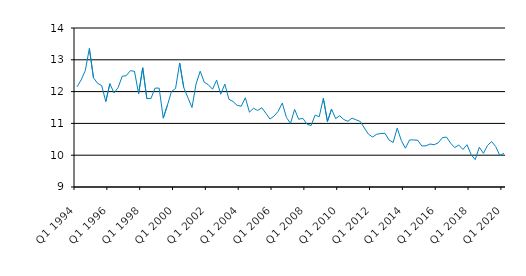
| Category | Series 0 |
|---|---|
| Q1 1994 | 12.15 |
| Q2 1994 | 12.369 |
| Q3 1994 | 12.659 |
| Q4 1994 | 13.357 |
| Q1 1995 | 12.435 |
| Q2 1995 | 12.262 |
| Q3 1995 | 12.188 |
| Q4 1995 | 11.688 |
| Q1 1996 | 12.25 |
| Q2 1996 | 11.958 |
| Q3 1996 | 12.125 |
| Q4 1996 | 12.483 |
| Q1 1997 | 12.5 |
| Q2 1997 | 12.662 |
| Q3 1997 | 12.633 |
| Q4 1997 | 11.933 |
| Q1 1998 | 12.75 |
| Q2 1998 | 11.781 |
| Q3 1998 | 11.781 |
| Q4 1998 | 12.11 |
| Q1 1999 | 12.11 |
| Q2 1999 | 11.166 |
| Q3 1999 | 11.566 |
| Q4 1999 | 12 |
| Q1 2000 | 12.1 |
| Q2 2000 | 12.899 |
| Q3 2000 | 12.125 |
| Q4 2000 | 11.812 |
| Q1 2001 | 11.5 |
| Q2 2001 | 12.241 |
| Q3 2001 | 12.642 |
| Q4 2001 | 12.291 |
| Q1 2002 | 12.215 |
| Q2 2002 | 12.075 |
| Q3 2002 | 12.36 |
| Q4 2002 | 11.917 |
| Q1 2003 | 12.236 |
| Q2 2003 | 11.761 |
| Q3 2003 | 11.688 |
| Q4 2003 | 11.569 |
| Q1 2004 | 11.539 |
| Q2 2004 | 11.807 |
| Q3 2004 | 11.354 |
| Q4 2004 | 11.477 |
| Q1 2005 | 11.406 |
| Q2 2005 | 11.493 |
| Q3 2005 | 11.318 |
| Q4 2005 | 11.136 |
| Q1 2006 | 11.231 |
| Q2 2006 | 11.38 |
| Q3 2006 | 11.64 |
| Q4 2006 | 11.19 |
| Q1 2007 | 11 |
| Q2 2007 | 11.44 |
| Q3 2007 | 11.13 |
| Q4 2007 | 11.16 |
| Q1 2008 | 10.98 |
| Q2 2008 | 10.93 |
| Q3 2008 | 11.26 |
| Q4 2008 | 11.21 |
| Q1 2009 | 11.79 |
| Q2 2009 | 11.06 |
| Q3 2009 | 11.45 |
| Q4 2009 | 11.15 |
| Q1 2010 | 11.24 |
| Q2 2010 | 11.12 |
| Q3 2010 | 11.067 |
| Q4 2010 | 11.166 |
| Q1 2011 | 11.11 |
| Q2 2011 | 11.06 |
| Q3 2011 | 10.855 |
| Q4 2011 | 10.66 |
| Q1 2012 | 10.57 |
| Q2 2012 | 10.66 |
| Q3 2012 | 10.68 |
| Q4 2012 | 10.69 |
| Q1 2013 | 10.48 |
| Q2 2013 | 10.4 |
| Q3 2013 | 10.85 |
| Q4 2013 | 10.46 |
| Q1 2014 | 10.22 |
| Q2 2014 | 10.479 |
| Q3 2014 | 10.48 |
| Q4 2014 | 10.47 |
| Q1 2015 | 10.29 |
| Q2 2015 | 10.295 |
| Q3 2015 | 10.352 |
| Q4 2015 | 10.33 |
| Q1 2016 | 10.39 |
| Q2 2016 | 10.55 |
| Q3 2016 | 10.57 |
| Q4 2016 | 10.38 |
| Q1 2017 | 10.24 |
| Q2 2017 | 10.32 |
| Q3 2017 | 10.18 |
| Q4 2017 | 10.33 |
| Q1 2018 | 10.02 |
| Q2 2018 | 9.86 |
| Q3 2018 | 10.251 |
| Q4 2018 | 10.06 |
| Q1 2019 | 10.308 |
| Q2 2019 | 10.429 |
| Q3 2019 | 10.271 |
| Q4 2019* | 9.989 |
| Q1 2020 | 10.064 |